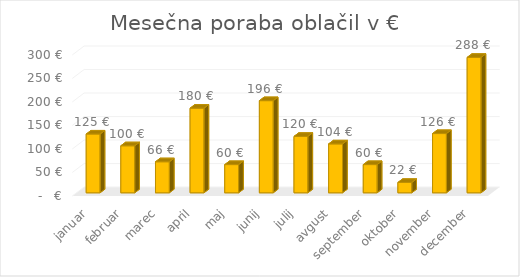
| Category | Series 0 |
|---|---|
| januar | 125 |
| februar | 100 |
| marec | 66 |
| april | 180 |
| maj | 60 |
| junij | 196 |
| julij | 120 |
| avgust | 104 |
| september | 60 |
| oktober | 22 |
| november | 126 |
| december | 288 |